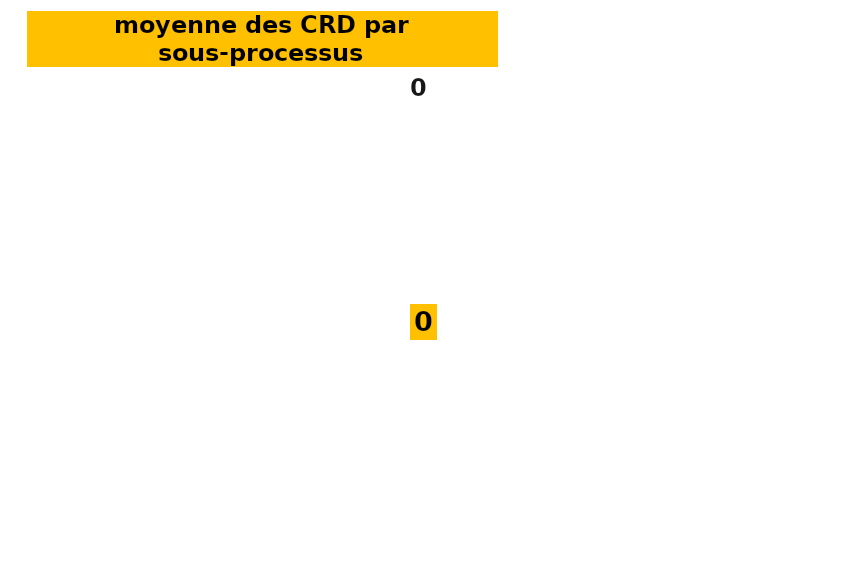
| Category | CR Detection | Series 1 | Series 2 | Series 3 |
|---|---|---|---|---|
| 0.0 | 0 | 6 | 13 | 25 |